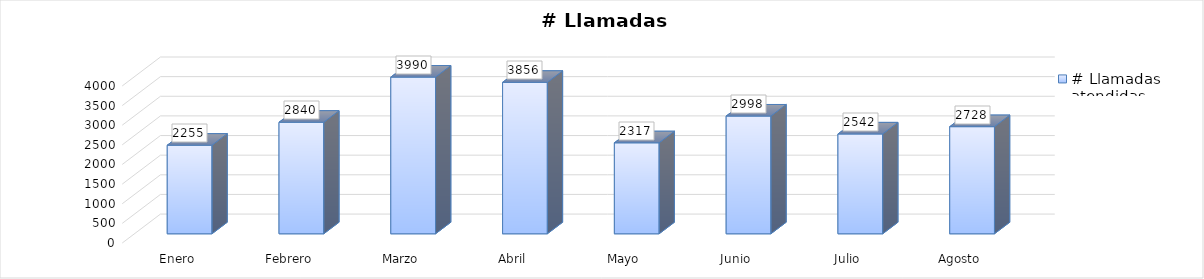
| Category | # Llamadas atendidas |
|---|---|
| Enero | 2255 |
| Febrero | 2840 |
| Marzo | 3990 |
| Abril | 3856 |
| Mayo | 2317 |
| Junio | 2998 |
| Julio | 2542 |
| Agosto | 2728 |